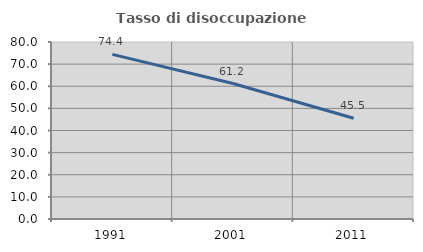
| Category | Tasso di disoccupazione giovanile  |
|---|---|
| 1991.0 | 74.405 |
| 2001.0 | 61.224 |
| 2011.0 | 45.528 |